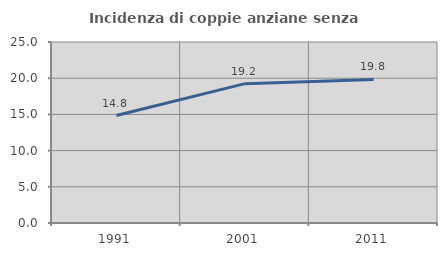
| Category | Incidenza di coppie anziane senza figli  |
|---|---|
| 1991.0 | 14.841 |
| 2001.0 | 19.245 |
| 2011.0 | 19.831 |